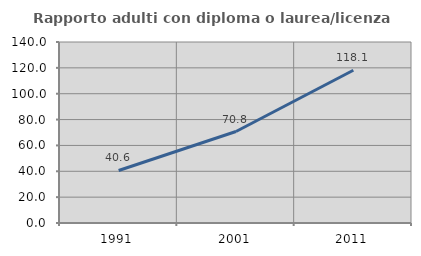
| Category | Rapporto adulti con diploma o laurea/licenza media  |
|---|---|
| 1991.0 | 40.644 |
| 2001.0 | 70.769 |
| 2011.0 | 118.134 |